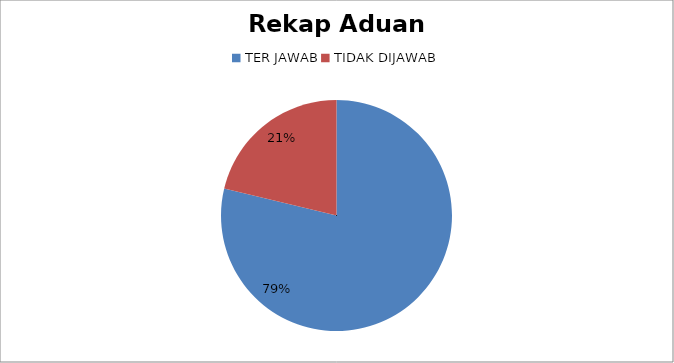
| Category | Series 0 |
|---|---|
| TER JAWAB | 63 |
| TIDAK DIJAWAB | 17 |